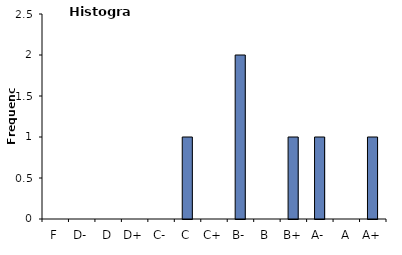
| Category | Grade |
|---|---|
| F | 0 |
| D- | 0 |
| D | 0 |
| D+ | 0 |
| C- | 0 |
| C | 1 |
| C+ | 0 |
| B- | 2 |
| B | 0 |
| B+ | 1 |
| A- | 1 |
| A | 0 |
| A+ | 1 |